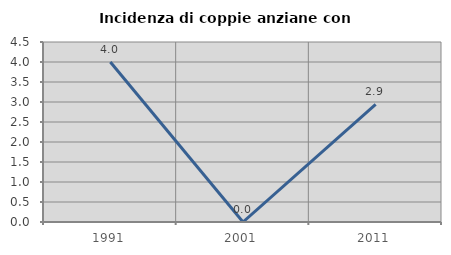
| Category | Incidenza di coppie anziane con figli |
|---|---|
| 1991.0 | 4 |
| 2001.0 | 0 |
| 2011.0 | 2.941 |